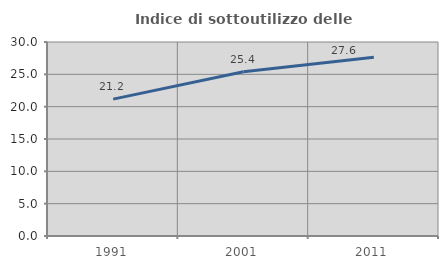
| Category | Indice di sottoutilizzo delle abitazioni  |
|---|---|
| 1991.0 | 21.162 |
| 2001.0 | 25.397 |
| 2011.0 | 27.642 |